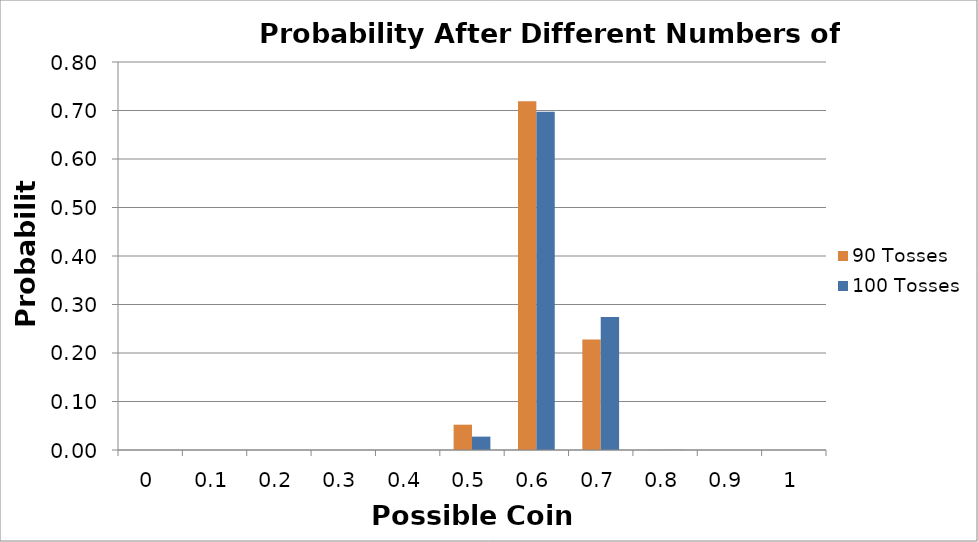
| Category | 90 Tosses | 100 Tosses |
|---|---|---|
| 0.0 | 0 | 0 |
| 0.1 | 0 | 0 |
| 0.2 | 0 | 0 |
| 0.3 | 0 | 0 |
| 0.4 | 0 | 0 |
| 0.5 | 0.052 | 0.028 |
| 0.6 | 0.719 | 0.698 |
| 0.7 | 0.228 | 0.274 |
| 0.8 | 0 | 0 |
| 0.9 | 0 | 0 |
| 1.0 | 0 | 0 |